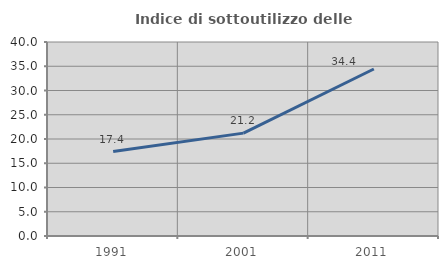
| Category | Indice di sottoutilizzo delle abitazioni  |
|---|---|
| 1991.0 | 17.416 |
| 2001.0 | 21.212 |
| 2011.0 | 34.437 |